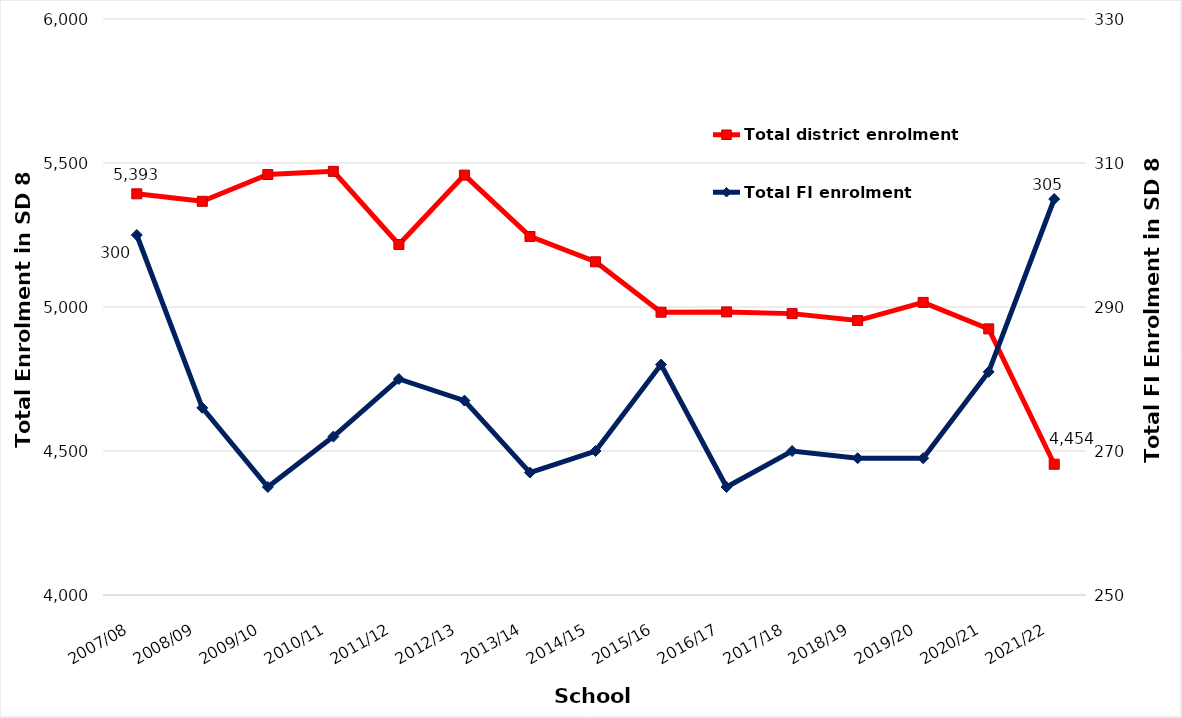
| Category | Total district enrolment  |
|---|---|
| 2007/08 | 5393 |
| 2008/09 | 5367 |
| 2009/10 | 5460 |
| 2010/11 | 5471 |
| 2011/12 | 5217 |
| 2012/13 | 5458 |
| 2013/14 | 5245 |
| 2014/15 | 5157 |
| 2015/16 | 4982 |
| 2016/17 | 4983 |
| 2017/18 | 4977 |
| 2018/19 | 4953 |
| 2019/20 | 5016 |
| 2020/21 | 4924 |
| 2021/22 | 4454 |